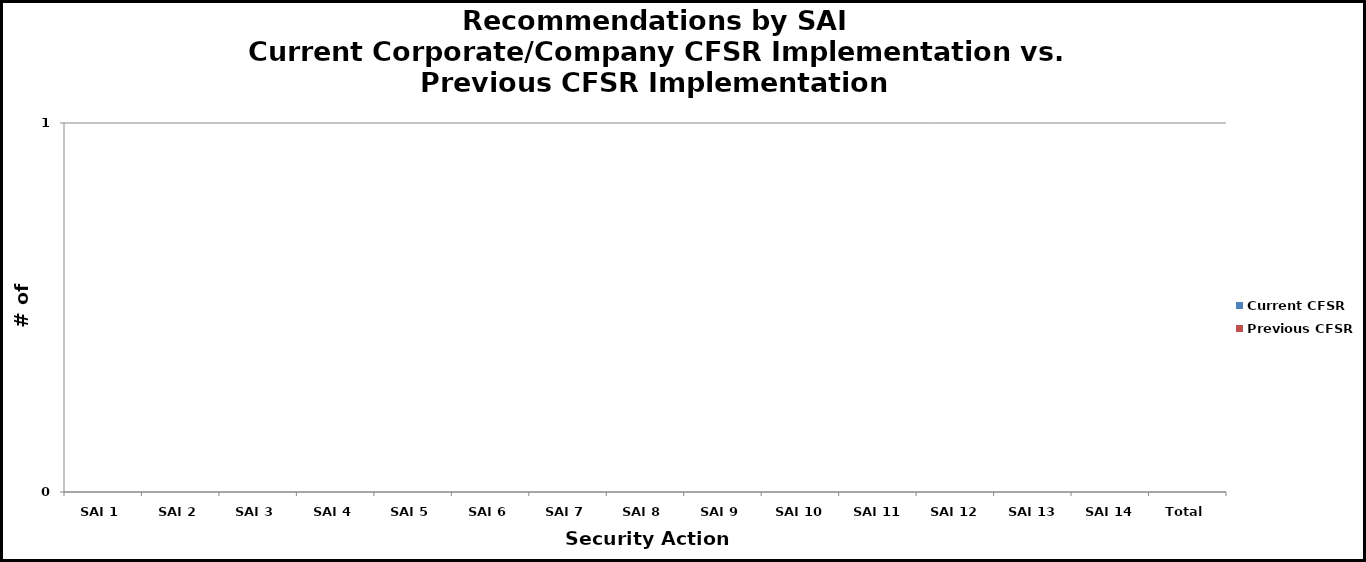
| Category | Current CFSR | Previous CFSR |
|---|---|---|
| SAI 1 | 0 | 0 |
| SAI 2 | 0 | 0 |
| SAI 3 | 0 | 0 |
| SAI 4 | 0 | 0 |
| SAI 5 | 0 | 0 |
| SAI 6 | 0 | 0 |
| SAI 7 | 0 | 0 |
| SAI 8 | 0 | 0 |
| SAI 9 | 0 | 0 |
| SAI 10 | 0 | 0 |
| SAI 11 | 0 | 0 |
| SAI 12 | 0 | 0 |
| SAI 13 | 0 | 0 |
| SAI 14 | 0 | 0 |
| Total | 0 | 0 |